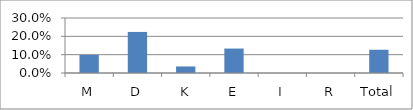
| Category | Series 0 |
|---|---|
| M | 0.099 |
| D | 0.224 |
| K | 0.036 |
| E | 0.133 |
| I | 0 |
| R | 0 |
| Total | 0.127 |